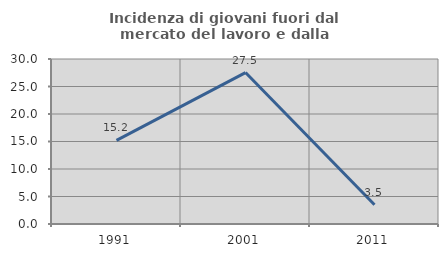
| Category | Incidenza di giovani fuori dal mercato del lavoro e dalla formazione  |
|---|---|
| 1991.0 | 15.2 |
| 2001.0 | 27.536 |
| 2011.0 | 3.509 |